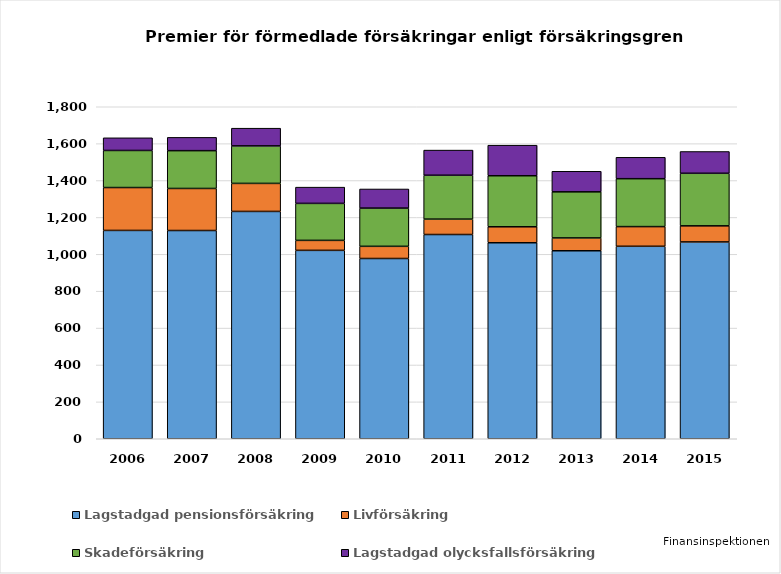
| Category | Lagstadgad pensionsförsäkring | Livförsäkring | Skadeförsäkring | Lagstadgad olycksfallsförsäkring |
|---|---|---|---|---|
| 2006.0 | 1129.49 | 232.47 | 201.056 | 68.612 |
| 2007.0 | 1129 | 228 | 205 | 72 |
| 2008.0 | 1232.449 | 151.996 | 203.425 | 95.962 |
| 2009.0 | 1021.457 | 54.107 | 200.56 | 88.041 |
| 2010.0 | 977.321 | 65.95 | 207.341 | 103.558 |
| 2011.0 | 1107.329 | 83.403 | 238.041 | 136.289 |
| 2012.0 | 1062.705 | 86.597 | 276.62 | 165.706 |
| 2013.0 | 1019.216 | 69.648 | 249.823 | 111.515 |
| 2014.0 | 1043.573 | 106.619 | 259.835 | 115.957 |
| 2015.0 | 1067.062 | 87.285 | 284.943 | 118.153 |